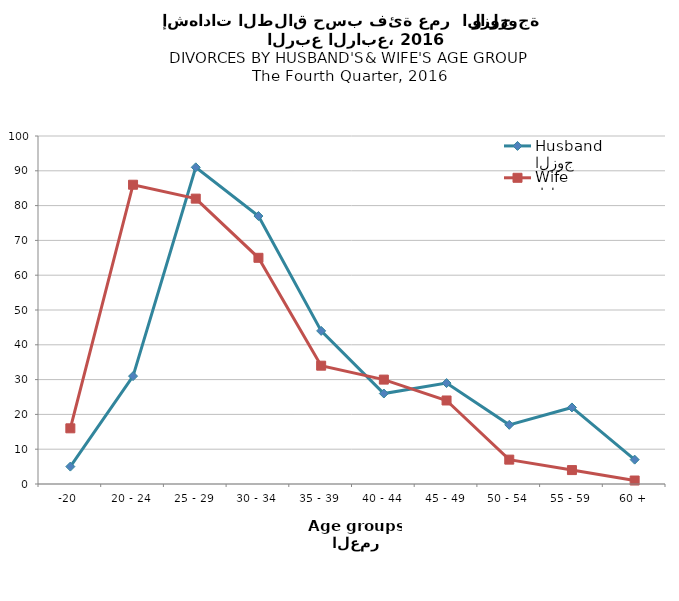
| Category | الزوج
Husband |  الزوجة
Wife |
|---|---|---|
| -20 | 5 | 16 |
| 20 - 24 | 31 | 86 |
| 25 - 29 | 91 | 82 |
| 30 - 34 | 77 | 65 |
| 35 - 39 | 44 | 34 |
| 40 - 44 | 26 | 30 |
| 45 - 49 | 29 | 24 |
| 50 - 54 | 17 | 7 |
| 55 - 59 | 22 | 4 |
| 60 + | 7 | 1 |